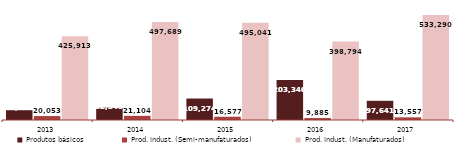
| Category | Produtos básicos | Prod. Indust. (Semi-manufaturados) | Prod. Indust. (Manufaturados) |
|---|---|---|---|
| 2013.0 | 49863 | 20053 | 425913 |
| 2014.0 | 62540 | 21104 | 497689 |
| 2015.0 | 109274 | 16577 | 495041 |
| 2016.0 | 203340 | 9885 | 398794 |
| 2017.0 | 97640.761 | 13557.2 | 533290.182 |